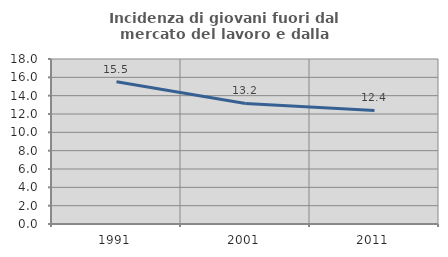
| Category | Incidenza di giovani fuori dal mercato del lavoro e dalla formazione  |
|---|---|
| 1991.0 | 15.512 |
| 2001.0 | 13.152 |
| 2011.0 | 12.386 |